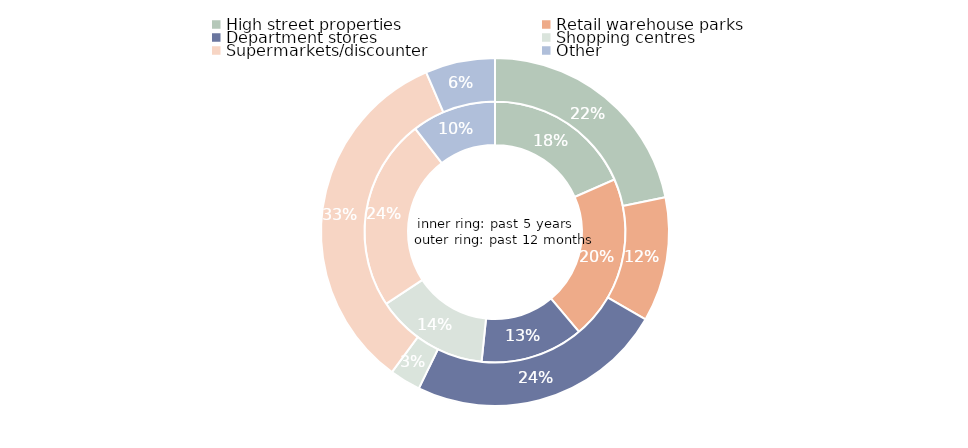
| Category | Series 1 | Series 0 |
|---|---|---|
| High street properties | 1671103491.282 | 1322829834 |
| Retail warehouse parks | 1856951664.09 | 702304525 |
| Department stores | 1160932182.858 | 1446510585 |
| Shopping centres | 1278097530.186 | 174637151 |
| Supermarkets/discounter | 2161720044.926 | 2028371161.3 |
| Other | 949964171.258 | 393113198 |